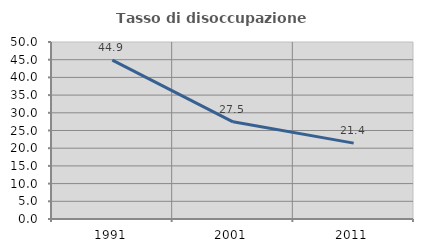
| Category | Tasso di disoccupazione giovanile  |
|---|---|
| 1991.0 | 44.872 |
| 2001.0 | 27.451 |
| 2011.0 | 21.429 |